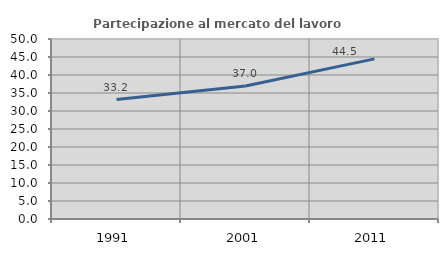
| Category | Partecipazione al mercato del lavoro  femminile |
|---|---|
| 1991.0 | 33.163 |
| 2001.0 | 36.952 |
| 2011.0 | 44.486 |